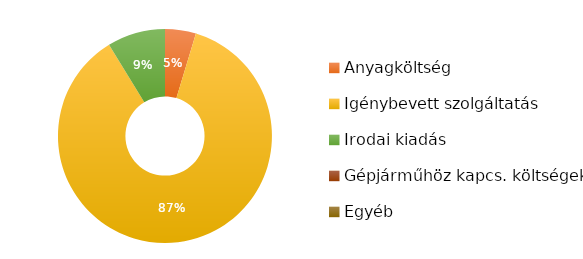
| Category | Összesen |
|---|---|
| Anyagköltség | 25340 |
| Igénybevett szolgáltatás | 470000 |
| Irodai kiadás | 47560 |
| Gépjárműhöz kapcs. költségek | 0 |
| Egyéb | 0 |